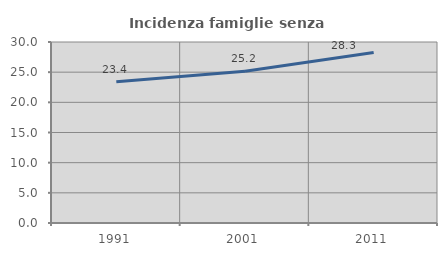
| Category | Incidenza famiglie senza nuclei |
|---|---|
| 1991.0 | 23.404 |
| 2001.0 | 25.168 |
| 2011.0 | 28.259 |